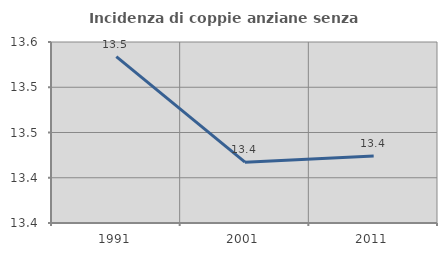
| Category | Incidenza di coppie anziane senza figli  |
|---|---|
| 1991.0 | 13.534 |
| 2001.0 | 13.417 |
| 2011.0 | 13.424 |